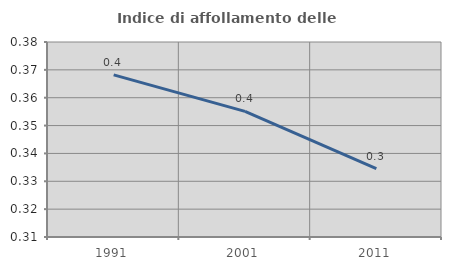
| Category | Indice di affollamento delle abitazioni  |
|---|---|
| 1991.0 | 0.368 |
| 2001.0 | 0.355 |
| 2011.0 | 0.335 |